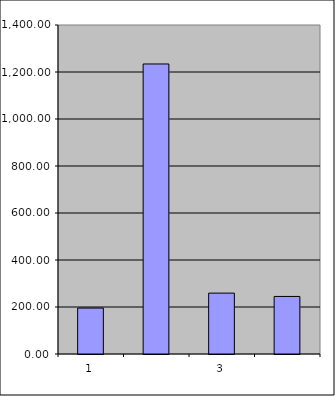
| Category | Series 0 |
|---|---|
| 0 | 195.5 |
| 1 | 1234.113 |
| 2 | 259.067 |
| 3 | 244.889 |